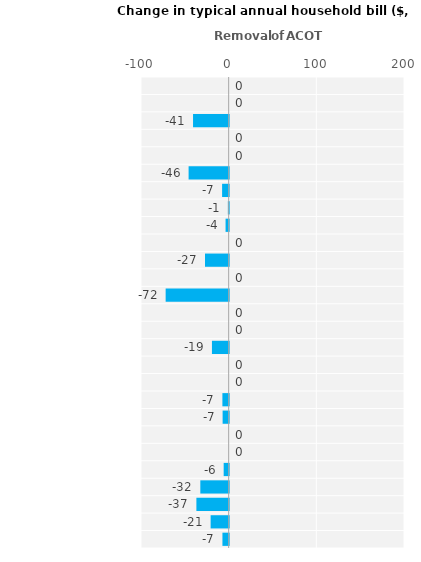
| Category | Series 0 |
|---|---|
| Eastland Network | -7.101 |
| Unison Networks | -20.583 |
| Aurora Energy | -36.811 |
| WEL Networks | -32.335 |
| Wellington Electricity | -5.696 |
| Waipa Networks | 0 |
| Centralines | 0 |
| PowerNet Ltd | -6.907 |
| Powerco | -7.148 |
| Orion NZ | 0 |
| Scanpower | 0 |
| Network Tasman | -19.081 |
| MainPower NZ | 0 |
| Marlborough Lines | 0 |
| Westpower | -71.882 |
| Alpine Energy | 0 |
| The Lines Company | -27.028 |
| Nelson Electricity | 0 |
| Counties Energy | -3.539 |
| Vector Lines | -0.933 |
| Northpower | -7.485 |
| Horizon Energy | -45.701 |
| Electra | 0 |
| Network Waitaki | 0 |
| Top Energy | -40.644 |
| EA Networks | 0 |
| Buller Electricity | 0 |